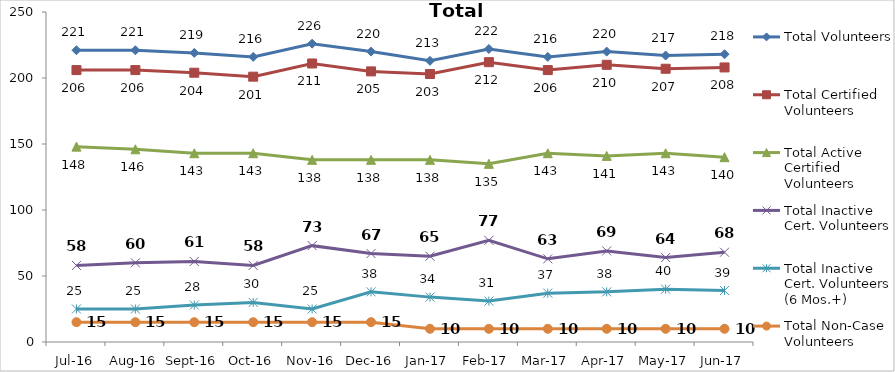
| Category | Total Volunteers | Total Certified Volunteers | Total Active Certified Volunteers | Total Inactive Cert. Volunteers | Total Inactive Cert. Volunteers (6 Mos.+) | Total Non-Case Volunteers |
|---|---|---|---|---|---|---|
| Jul-16 | 221 | 206 | 148 | 58 | 25 | 15 |
| Aug-16 | 221 | 206 | 146 | 60 | 25 | 15 |
| Sep-16 | 219 | 204 | 143 | 61 | 28 | 15 |
| Oct-16 | 216 | 201 | 143 | 58 | 30 | 15 |
| Nov-16 | 226 | 211 | 138 | 73 | 25 | 15 |
| Dec-16 | 220 | 205 | 138 | 67 | 38 | 15 |
| Jan-17 | 213 | 203 | 138 | 65 | 34 | 10 |
| Feb-17 | 222 | 212 | 135 | 77 | 31 | 10 |
| Mar-17 | 216 | 206 | 143 | 63 | 37 | 10 |
| Apr-17 | 220 | 210 | 141 | 69 | 38 | 10 |
| May-17 | 217 | 207 | 143 | 64 | 40 | 10 |
| Jun-17 | 218 | 208 | 140 | 68 | 39 | 10 |